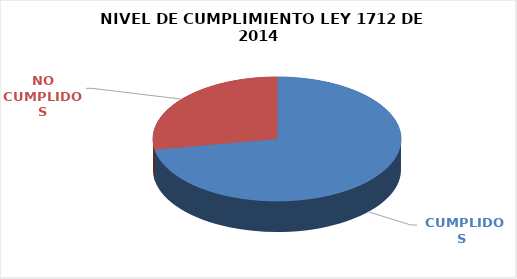
| Category | Series 0 |
|---|---|
|  CUMPLIDOS | 83 |
| NO CUMPLIDOS | 32 |